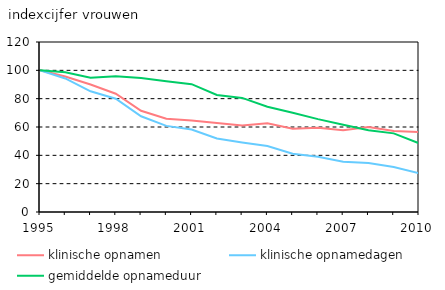
| Category | klinische opnamen | klinische opnamedagen | gemiddelde opnameduur |
|---|---|---|---|
| 1995.0 | 100 | 100 | 100 |
| 1996.0 | 95.661 | 94.289 | 98.566 |
| 1997.0 | 89.957 | 85.189 | 94.7 |
| 1998.0 | 83.507 | 79.962 | 95.755 |
| 1999.0 | 71.425 | 67.554 | 94.581 |
| 2000.0 | 65.833 | 60.787 | 92.335 |
| 2001.0 | 64.56 | 58.259 | 90.24 |
| 2002.0 | 62.807 | 51.861 | 82.571 |
| 2003.0 | 60.981 | 49.106 | 80.526 |
| 2004.0 | 62.631 | 46.53 | 74.292 |
| 2005.0 | 58.696 | 41.125 | 70.064 |
| 2006.0 | 59.517 | 39.026 | 65.572 |
| 2007.0 | 57.709 | 35.55 | 61.602 |
| 2008.0 | 59.937 | 34.62 | 57.76 |
| 2009.0 | 57.229 | 31.768 | 55.511 |
| 2010.0 | 56.515 | 27.393 | 48.47 |